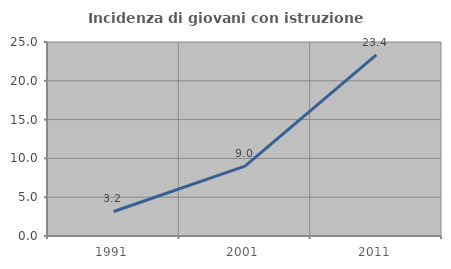
| Category | Incidenza di giovani con istruzione universitaria |
|---|---|
| 1991.0 | 3.158 |
| 2001.0 | 8.995 |
| 2011.0 | 23.353 |